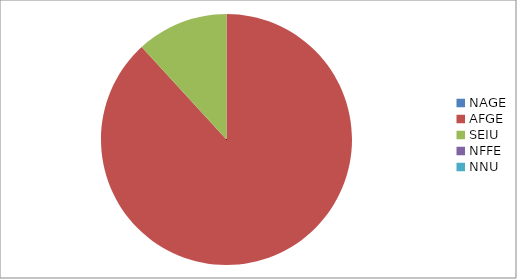
| Category | Series 0 |
|---|---|
| NAGE | 0 |
| AFGE | 9566 |
| SEIU | 1281 |
| NFFE | 0 |
| NNU | 0 |